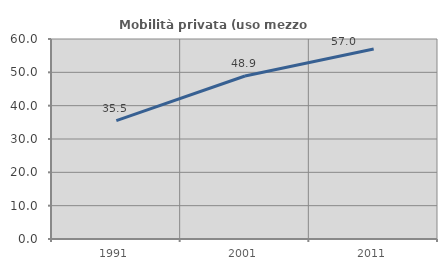
| Category | Mobilità privata (uso mezzo privato) |
|---|---|
| 1991.0 | 35.514 |
| 2001.0 | 48.891 |
| 2011.0 | 57.025 |